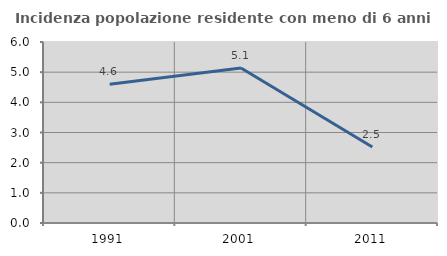
| Category | Incidenza popolazione residente con meno di 6 anni |
|---|---|
| 1991.0 | 4.602 |
| 2001.0 | 5.14 |
| 2011.0 | 2.517 |